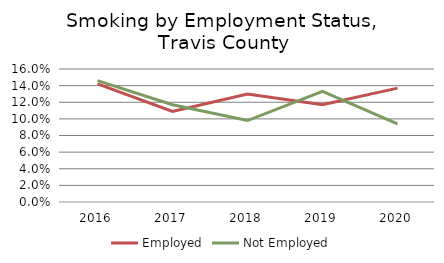
| Category | Employed | Not Employed |
|---|---|---|
| 2016.0 | 0.142 | 0.146 |
| 2017.0 | 0.109 | 0.117 |
| 2018.0 | 0.13 | 0.098 |
| 2019.0 | 0.117 | 0.133 |
| 2020.0 | 0.137 | 0.094 |